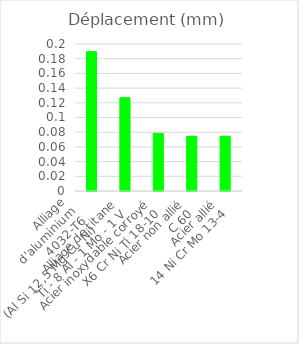
| Category | Series 0 |
|---|---|
| Alliage
d'aluminium
4032-T6
(Al Si 12,5 Mg Cu Ni) | 0.19 |
| Alliage de titane
Ti - 8 Al - 1 Mo - 1 V | 0.127 |
| Acier inoxydable corroyé
X6 Cr Ni Ti 18-10 | 0.078 |
| Acier non allié
C 60 | 0.074 |
| Acier allié
14 Ni Cr Mo 13-4 | 0.074 |